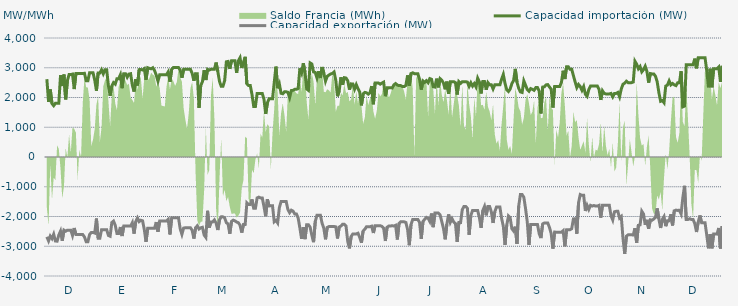
| Category | Capacidad importación (MW) | Capacidad exportación (MW) |
|---|---|---|
| 0 | 2616.667 | -2683.333 |
| 1900-01-01 | 1850 | -2820.833 |
| 1900-01-02 | 2268.75 | -2658.333 |
| 1900-01-03 | 1795.833 | -2741.667 |
| 1900-01-04 | 1725 | -2595.833 |
| 1900-01-05 | 1808.333 | -2825 |
| 1900-01-06 | 1808.333 | -2829.167 |
| 1900-01-07 | 1808.333 | -2622.917 |
| 1900-01-08 | 2750 | -2491.667 |
| 1900-01-09 | 2385.417 | -2816.667 |
| 1900-01-10 | 2770.833 | -2458.333 |
| 1900-01-11 | 1937.5 | -2495.833 |
| 1900-01-12 | 2562.5 | -2458.333 |
| 1900-01-13 | 2770.833 | -2458.333 |
| 1900-01-14 | 2770.833 | -2458.333 |
| 1900-01-15 | 2787.5 | -2637.5 |
| 1900-01-16 | 2283.333 | -2387.5 |
| 1900-01-17 | 2808.333 | -2606.25 |
| 1900-01-18 | 2808.333 | -2606.25 |
| 1900-01-19 | 2808.333 | -2606.25 |
| 1900-01-20 | 2808.333 | -2606.25 |
| 1900-01-21 | 2808.333 | -2606.25 |
| 1900-01-22 | 2812.5 | -2687.5 |
| 1900-01-23 | 2562.5 | -2847.917 |
| 1900-01-24 | 2562.5 | -2847.917 |
| 1900-01-25 | 2833.333 | -2606.25 |
| 1900-01-26 | 2833.333 | -2535.417 |
| 1900-01-27 | 2833.333 | -2535.417 |
| 1900-01-28 | 2587.5 | -2556.25 |
| 1900-01-29 | 2229.167 | -2068.75 |
| 1900-01-30 | 2825 | -2729.167 |
| 1900-01-31 | 2825 | -2729.167 |
| 1900-02-01 | 2933.333 | -2441.667 |
| 1900-02-02 | 2795.833 | -2441.667 |
| 1900-02-03 | 2933.333 | -2441.667 |
| 1900-02-04 | 2933.333 | -2441.667 |
| 1900-02-05 | 2397.917 | -2637.5 |
| 1900-02-06 | 2056.25 | -2662.5 |
| 1900-02-07 | 2383.333 | -2202.083 |
| 1900-02-08 | 2500 | -2154.167 |
| 1900-02-09 | 2450 | -2293.75 |
| 1900-02-10 | 2633.333 | -2570.833 |
| 1900-02-11 | 2633.333 | -2570.833 |
| 1900-02-12 | 2762.5 | -2352.083 |
| 1900-02-13 | 2312.5 | -2656.25 |
| 1900-02-14 | 2800 | -2322.917 |
| 1900-02-15 | 2800 | -2322.917 |
| 1900-02-16 | 2683.333 | -2322.917 |
| 1900-02-17 | 2787.5 | -2322.917 |
| 1900-02-18 | 2800 | -2322.917 |
| 1900-02-19 | 2412.5 | -2206.25 |
| 1900-02-20 | 2200 | -2575 |
| 1900-02-21 | 2616.667 | -2170.833 |
| 1900-02-22 | 2404.167 | -2045.833 |
| 1900-02-23 | 2937.5 | -2170.833 |
| 1900-02-24 | 2941.667 | -2125 |
| 1900-02-25 | 2925 | -2145.833 |
| 1900-02-26 | 2968.75 | -2437.5 |
| 1900-02-27 | 2593.75 | -2854.167 |
| 1900-02-28 | 3000 | -2395.833 |
| 1900-02-28 | 2979.167 | -2395.833 |
| 1900-03-01 | 2964.583 | -2395.833 |
| 1900-03-02 | 3000 | -2395.833 |
| 1900-03-03 | 2906.25 | -2395.833 |
| 1900-03-04 | 2750 | -2187.5 |
| 1900-03-05 | 2550 | -2512.5 |
| 1900-03-06 | 2766.667 | -2154.167 |
| 1900-03-07 | 2766.667 | -2154.167 |
| 1900-03-08 | 2766.667 | -2154.167 |
| 1900-03-09 | 2766.667 | -2154.167 |
| 1900-03-10 | 2766.667 | -2154.167 |
| 1900-03-11 | 2862.5 | -2093.75 |
| 1900-03-12 | 2529.167 | -2604.167 |
| 1900-03-13 | 2945.833 | -2041.667 |
| 1900-03-14 | 3008.333 | -2041.667 |
| 1900-03-15 | 3008.333 | -2041.667 |
| 1900-03-16 | 3008.333 | -2041.667 |
| 1900-03-17 | 3008.333 | -2041.667 |
| 1900-03-18 | 2922.917 | -2412.5 |
| 1900-03-19 | 2662.5 | -2600 |
| 1900-03-20 | 2945.833 | -2389.583 |
| 1900-03-21 | 2945.833 | -2377.083 |
| 1900-03-22 | 2945.833 | -2377.083 |
| 1900-03-23 | 2945.833 | -2377.083 |
| 1900-03-24 | 2945.833 | -2379.167 |
| 1900-03-25 | 2812.5 | -2462.5 |
| 1900-03-26 | 2562.5 | -2741.667 |
| 1900-03-27 | 2802.083 | -2377.083 |
| 1900-03-28 | 2800 | -2312.5 |
| 1900-03-29 | 1650 | -2420.833 |
| 1900-03-30 | 2400 | -2379.167 |
| 1900-03-31 | 2533.333 | -2362.5 |
| 1900-04-01 | 2918.75 | -2622.917 |
| 1900-04-02 | 2587.5 | -2702.083 |
| 1900-04-03 | 2947.917 | -1808.333 |
| 1900-04-04 | 2922.917 | -2372.917 |
| 1900-04-05 | 2947.917 | -2181.25 |
| 1900-04-06 | 2947.917 | -2181.25 |
| 1900-04-07 | 2947.917 | -2114.583 |
| 1900-04-08 | 3175 | -2225 |
| 1900-04-09 | 2875 | -2454.167 |
| 1900-04-10 | 2535.417 | -2108.333 |
| 1900-04-11 | 2375 | -2012.5 |
| 1900-04-12 | 2375 | -2012.5 |
| 1900-04-13 | 2566.667 | -2043.75 |
| 1900-04-14 | 3200 | -2208.333 |
| 1900-04-15 | 3212.5 | -2250 |
| 1900-04-16 | 2962.5 | -2579.167 |
| 1900-04-17 | 3233.333 | -2166.667 |
| 1900-04-18 | 3233.333 | -2122.917 |
| 1900-04-19 | 3233.333 | -2145.833 |
| 1900-04-20 | 2829.167 | -2185.417 |
| 1900-04-21 | 3233.333 | -2208.333 |
| 1900-04-22 | 3337.5 | -2293.75 |
| 1900-04-23 | 2991.304 | -2541.304 |
| 1900-04-24 | 3183.333 | -2268.75 |
| 1900-04-25 | 3366.667 | -2268.75 |
| 1900-04-26 | 2454.583 | -1541.667 |
| 1900-04-27 | 2400 | -1600 |
| 1900-04-28 | 2400 | -1600 |
| 1900-04-29 | 2100 | -1425 |
| 1900-04-30 | 1700 | -1725 |
| 1900-05-01 | 1700 | -1725 |
| 1900-05-02 | 2133.333 | -1375 |
| 1900-05-03 | 2133.333 | -1350 |
| 1900-05-04 | 2133.333 | -1375 |
| 1900-05-05 | 2133.333 | -1375 |
| 1900-05-06 | 1943.75 | -1662.5 |
| 1900-05-07 | 1447.917 | -1991.667 |
| 1900-05-08 | 1820.833 | -1420.833 |
| 1900-05-09 | 1958.333 | -1645.833 |
| 1900-05-10 | 1958.333 | -1637.5 |
| 1900-05-11 | 1958.333 | -1637.5 |
| 1900-05-12 | 2502.083 | -2177.083 |
| 1900-05-13 | 3037.5 | -2129.167 |
| 1900-05-14 | 2312.5 | -2216.667 |
| 1900-05-15 | 2456.25 | -1702.083 |
| 1900-05-16 | 2141.667 | -1497.917 |
| 1900-05-17 | 2125 | -1497.917 |
| 1900-05-18 | 2191.667 | -1497.917 |
| 1900-05-19 | 2191.667 | -1497.917 |
| 1900-05-20 | 2175 | -1766.667 |
| 1900-05-21 | 1997.917 | -1870.833 |
| 1900-05-22 | 2233.333 | -1787.5 |
| 1900-05-23 | 2241.667 | -1818.75 |
| 1900-05-24 | 2275 | -1914.583 |
| 1900-05-25 | 2275 | -1914.583 |
| 1900-05-26 | 2304.167 | -2052.083 |
| 1900-05-27 | 2979.167 | -2385.417 |
| 1900-05-28 | 2825 | -2752.083 |
| 1900-05-29 | 3154.167 | -2358.333 |
| 1900-05-30 | 2850 | -2760.417 |
| 1900-05-31 | 2285.417 | -2275 |
| 1900-06-01 | 2239.583 | -2275 |
| 1900-06-02 | 3162.5 | -2358.333 |
| 1900-06-03 | 3127.083 | -2631.25 |
| 1900-06-04 | 2858.333 | -2862.5 |
| 1900-06-05 | 2841.667 | -2166.667 |
| 1900-06-06 | 2656.25 | -1956.25 |
| 1900-06-07 | 2883.333 | -1956.25 |
| 1900-06-08 | 2656.25 | -1956.25 |
| 1900-06-09 | 3025 | -2229.167 |
| 1900-06-10 | 2831.25 | -2393.75 |
| 1900-06-11 | 2550.625 | -2766.667 |
| 1900-06-12 | 2710.417 | -2368.75 |
| 1900-06-13 | 2754.167 | -2337.5 |
| 1900-06-14 | 2791.667 | -2337.5 |
| 1900-06-15 | 2808.333 | -2337.5 |
| 1900-06-16 | 2858.333 | -2337.5 |
| 1900-06-17 | 2581.25 | -2347.917 |
| 1900-06-18 | 2041.667 | -2737.5 |
| 1900-06-19 | 2218.75 | -2354.167 |
| 1900-06-20 | 2679.167 | -2320.833 |
| 1900-06-21 | 2427.083 | -2260.417 |
| 1900-06-22 | 2666.667 | -2260.417 |
| 1900-06-23 | 2654.167 | -2320.833 |
| 1900-06-24 | 2562.5 | -2837.5 |
| 1900-06-25 | 2264.583 | -3070.833 |
| 1900-06-26 | 2458.333 | -2672.917 |
| 1900-06-27 | 2454.167 | -2585.417 |
| 1900-06-28 | 2279.167 | -2585.417 |
| 1900-06-29 | 2431.25 | -2585.417 |
| 1900-06-30 | 2295.833 | -2562.5 |
| 1900-07-01 | 2181.25 | -2700 |
| 1900-07-02 | 1735.417 | -2883.333 |
| 1900-07-03 | 2125 | -2487.5 |
| 1900-07-04 | 2170.833 | -2429.167 |
| 1900-07-05 | 2158.333 | -2341.667 |
| 1900-07-06 | 2112.5 | -2341.667 |
| 1900-07-07 | 2158.333 | -2341.667 |
| 1900-07-08 | 2383.333 | -2325 |
| 1900-07-09 | 1772.917 | -2554.167 |
| 1900-07-10 | 2485.417 | -2308.333 |
| 1900-07-11 | 2485.417 | -2308.333 |
| 1900-07-12 | 2485.417 | -2308.333 |
| 1900-07-13 | 2447.917 | -2308.333 |
| 1900-07-14 | 2485.417 | -2333.333 |
| 1900-07-15 | 2516.667 | -2387.5 |
| 1900-07-16 | 2043.75 | -2822.917 |
| 1900-07-17 | 2331.25 | -2362.5 |
| 1900-07-18 | 2331.25 | -2320.833 |
| 1900-07-19 | 2331.25 | -2320.833 |
| 1900-07-20 | 2318.75 | -2308.333 |
| 1900-07-21 | 2425 | -2320.833 |
| 1900-07-22 | 2468.75 | -2295.833 |
| 1900-07-23 | 2418.75 | -2772.917 |
| 1900-07-24 | 2400 | -2235.417 |
| 1900-07-25 | 2400 | -2179.167 |
| 1900-07-26 | 2366.667 | -2179.167 |
| 1900-07-27 | 2366.667 | -2179.167 |
| 1900-07-28 | 2404.167 | -2200 |
| 1900-07-29 | 2743.75 | -2437.5 |
| 1900-07-30 | 2393.75 | -2964.583 |
| 1900-07-31 | 2804.167 | -2270.833 |
| 1900-08-01 | 2829.167 | -2097.917 |
| 1900-08-02 | 2800 | -2097.917 |
| 1900-08-03 | 2800 | -2097.917 |
| 1900-08-04 | 2800 | -2097.917 |
| 1900-08-05 | 2610.417 | -2200 |
| 1900-08-06 | 2264.583 | -2750 |
| 1900-08-07 | 2556.25 | -2166.667 |
| 1900-08-08 | 2506.25 | -2095.833 |
| 1900-08-09 | 2564.583 | -2029.167 |
| 1900-08-10 | 2497.917 | -2058.333 |
| 1900-08-11 | 2635.417 | -2166.667 |
| 1900-08-12 | 2612.5 | -1900 |
| 1900-08-13 | 2362.5 | -2358.333 |
| 1900-08-14 | 2350 | -1885.417 |
| 1900-08-15 | 2633.333 | -1885.417 |
| 1900-08-16 | 2341.667 | -1885.417 |
| 1900-08-17 | 2633.333 | -1943.75 |
| 1900-08-18 | 2579.167 | -2168.75 |
| 1900-08-19 | 2485.417 | -2400 |
| 1900-08-20 | 2275 | -2766.667 |
| 1900-08-21 | 2533.333 | -2252.083 |
| 1900-08-22 | 2125 | -1929.167 |
| 1900-08-23 | 2533.333 | -2195.833 |
| 1900-08-24 | 2533.333 | -2072.917 |
| 1900-08-25 | 2533.333 | -2187.5 |
| 1900-08-26 | 2500 | -2237.5 |
| 1900-08-27 | 2100 | -2856.25 |
| 1900-08-28 | 2533.333 | -2202.083 |
| 1900-08-29 | 2475 | -2202.083 |
| 1900-08-30 | 2533.333 | -1768.75 |
| 1900-08-31 | 2533.333 | -1662.5 |
| 1900-09-01 | 2533.333 | -1662.5 |
| 1900-09-02 | 2518.75 | -1725 |
| 1900-09-03 | 2375 | -2614.583 |
| 1900-09-04 | 2495.833 | -1964.583 |
| 1900-09-05 | 2383.333 | -1800 |
| 1900-09-06 | 2466.667 | -1800 |
| 1900-09-07 | 2358.333 | -1800 |
| 1900-09-08 | 2650 | -1800 |
| 1900-09-09 | 2525 | -2037.5 |
| 1900-09-10 | 2135.417 | -2381.25 |
| 1900-09-11 | 2537.5 | -1800 |
| 1900-09-12 | 2537.5 | -1662.5 |
| 1900-09-13 | 2260.417 | -1960.417 |
| 1900-09-14 | 2500 | -1662.5 |
| 1900-09-15 | 2425 | -1662.5 |
| 1900-09-16 | 2425 | -1843.75 |
| 1900-09-17 | 2287.5 | -2216.667 |
| 1900-09-18 | 2425 | -1843.75 |
| 1900-09-19 | 2425 | -1681.25 |
| 1900-09-20 | 2425 | -1681.25 |
| 1900-09-21 | 2425 | -1681.25 |
| 1900-09-22 | 2616.667 | -2062.5 |
| 1900-09-23 | 2775 | -2329.167 |
| 1900-09-24 | 2475 | -2956.25 |
| 1900-09-25 | 2258.333 | -2293.75 |
| 1900-09-26 | 2200 | -1981.25 |
| 1900-09-27 | 2283.333 | -2043.75 |
| 1900-09-28 | 2466.667 | -2410.417 |
| 1900-09-29 | 2570.833 | -2485.417 |
| 1900-09-30 | 2962.5 | -2341.667 |
| 1900-10-01 | 2512.5 | -2920.833 |
| 1900-10-02 | 2308.333 | -1650 |
| 1900-10-03 | 2187.5 | -1262.5 |
| 1900-10-04 | 2170.833 | -1262.5 |
| 1900-10-05 | 2558.333 | -1352.083 |
| 1900-10-06 | 2416.667 | -1731.25 |
| 1900-10-07 | 2266.667 | -2175 |
| 1900-10-08 | 2208.333 | -2956.25 |
| 1900-10-09 | 2300 | -2268.75 |
| 1900-10-10 | 2275 | -2266.667 |
| 1900-10-11 | 2241.667 | -2266.667 |
| 1900-10-12 | 2333.333 | -2266.667 |
| 1900-10-13 | 2333.333 | -2270.833 |
| 1900-10-14 | 2212.5 | -2581.25 |
| 1900-10-15 | 1464.583 | -2725 |
| 1900-10-16 | 2350 | -2250 |
| 1900-10-17 | 2358.333 | -2218.75 |
| 1900-10-18 | 2425 | -2218.75 |
| 1900-10-19 | 2433.333 | -2218.75 |
| 1900-10-20 | 2354.167 | -2368.75 |
| 1900-10-21 | 2279.167 | -2575 |
| 1900-10-22 | 1662.5 | -3079.167 |
| 1900-10-23 | 2366.667 | -2522.917 |
| 1900-10-24 | 2366.667 | -2527.083 |
| 1900-10-25 | 2366.667 | -2527.083 |
| 1900-10-26 | 2366.667 | -2527.083 |
| 1900-10-27 | 2508.333 | -2527.083 |
| 1900-10-28 | 2900 | -2477.083 |
| 1900-10-29 | 2620.833 | -3004.167 |
| 1900-10-30 | 3033.333 | -2443.75 |
| 1900-10-31 | 3033.333 | -2443.75 |
| 1900-11-01 | 2950 | -2443.75 |
| 1900-11-02 | 2950 | -2410.417 |
| 1900-11-03 | 2735.417 | -2081.25 |
| 1900-11-04 | 2525 | -2075 |
| 1900-11-05 | 2332.667 | -2579.167 |
| 1900-11-06 | 2437.5 | -1537.5 |
| 1900-11-07 | 2366.667 | -1262.5 |
| 1900-11-08 | 2241.667 | -1287.5 |
| 1900-11-09 | 2366.667 | -1287.5 |
| 1900-11-10 | 2108.333 | -1814.583 |
| 1900-11-11 | 2039.583 | -1625 |
| 1900-11-12 | 2264.583 | -1762.5 |
| 1900-11-13 | 2383.333 | -1625 |
| 1900-11-14 | 2383.333 | -1650 |
| 1900-11-15 | 2383.333 | -1629.167 |
| 1900-11-16 | 2383.333 | -1650 |
| 1900-11-17 | 2383.333 | -1650 |
| 1900-11-18 | 2275 | -1625 |
| 1900-11-19 | 1918.75 | -2037.5 |
| 1900-11-20 | 2225 | -1625 |
| 1900-11-21 | 2138.417 | -1625 |
| 1900-11-22 | 2120.833 | -1625 |
| 1900-11-23 | 2120.833 | -1625 |
| 1900-11-24 | 2120.833 | -1625 |
| 1900-11-25 | 2137.5 | -1975 |
| 1900-11-26 | 2020 | -2116 |
| 1900-11-27 | 2137.5 | -1841.667 |
| 1900-11-28 | 2137.5 | -1825 |
| 1900-11-29 | 2170.833 | -1825 |
| 1900-11-30 | 2022.917 | -2054.167 |
| 1900-12-01 | 2287.5 | -2000 |
| 1900-12-02 | 2445.833 | -2731.25 |
| 1900-12-03 | 2481.25 | -3254.167 |
| 1900-12-04 | 2547.917 | -2662.5 |
| 1900-12-05 | 2500 | -2616.667 |
| 1900-12-06 | 2500 | -2616.667 |
| 1900-12-07 | 2500 | -2616.667 |
| 1900-12-08 | 2520.833 | -2620.833 |
| 1900-12-09 | 3218.75 | -2393.75 |
| 1900-12-10 | 3120.833 | -2885.417 |
| 1900-12-11 | 2966.667 | -2295.833 |
| 1900-12-12 | 3041.667 | -2281.25 |
| 1900-12-13 | 2862.5 | -1822.917 |
| 1900-12-14 | 2933.333 | -1914.583 |
| 1900-12-15 | 3050 | -2281.25 |
| 1900-12-16 | 2875 | -2112.5 |
| 1900-12-17 | 2500 | -2410.417 |
| 1900-12-18 | 2804.167 | -2112.5 |
| 1900-12-19 | 2791.667 | -2125 |
| 1900-12-20 | 2791.667 | -2083.333 |
| 1900-12-21 | 2716.667 | -2031.25 |
| 1900-12-22 | 2529.167 | -1727.083 |
| 1900-12-23 | 2162.5 | -2085.417 |
| 1900-12-24 | 1872.917 | -2385.417 |
| 1900-12-25 | 1897.917 | -2095.833 |
| 1900-12-26 | 1825 | -2002.083 |
| 1900-12-27 | 2383.333 | -2325 |
| 1900-12-28 | 2418.75 | -2145.833 |
| 1900-12-29 | 2558.333 | -2145.833 |
| 1900-12-30 | 2425 | -1925 |
| 1900-12-31 | 2470.833 | -2300 |
| 1901-01-01 | 2425 | -1808.333 |
| 1901-01-02 | 2400 | -1785.417 |
| 1901-01-03 | 2495.833 | -1795.833 |
| 1901-01-04 | 2497.917 | -1789.583 |
| 1901-01-05 | 2882.917 | -1912.5 |
| 1901-01-06 | 1685.417 | -1368.75 |
| 1901-01-07 | 1712.5 | -968.75 |
| 1901-01-08 | 3104.167 | -2100 |
| 1901-01-09 | 3104.167 | -2100 |
| 1901-01-10 | 3104.167 | -2075 |
| 1901-01-11 | 3104.167 | -2100 |
| 1901-01-12 | 3104.167 | -2100 |
| 1901-01-13 | 3306.25 | -2237.5 |
| 1901-01-14 | 2981.25 | -2520.833 |
| 1901-01-15 | 3333.333 | -2189.583 |
| 1901-01-16 | 3333.333 | -1964.583 |
| 1901-01-17 | 3333.333 | -2212.5 |
| 1901-01-18 | 3333.333 | -2212.5 |
| 1901-01-19 | 3333.333 | -2212.5 |
| 1901-01-20 | 2904.167 | -2625 |
| 1901-01-21 | 2343.75 | -3068.75 |
| 1901-01-22 | 2966.667 | -2589.583 |
| 1901-01-23 | 2343.75 | -3068.75 |
| 1901-01-24 | 2966.667 | -2589.583 |
| 1901-01-25 | 2966.667 | -2589.583 |
| 1901-01-26 | 2966.667 | -2589.583 |
| 1901-01-27 | 3025 | -2385.417 |
| 1901-01-28 | 2525 | -3075 |
| 1901-01-29 | 3066.667 | -2320.833 |